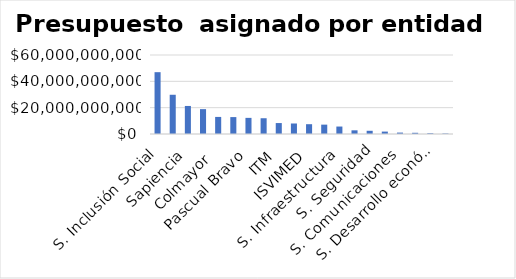
| Category | Presupuesto |
|---|---|
| S. Inclusión Social | 46953803461 |
| INDER | 29799417354 |
| Sapiencia | 21296134406 |
| S. Salud | 18881063704 |
| Colmayor  | 12969926120 |
| S. Cultura Ciudadana | 12843092527 |
| Pascual Bravo | 12250037945 |
| S. Participación Ciudadana | 11972732138 |
| ITM | 8310175528 |
| S. Medio ambiente | 7981069144 |
| ISVIMED | 7446149934 |
| S. Educación  | 7111733762 |
| S. Infraestructura | 5666421682 |
| S. Juventud | 2794085664 |
| S. Seguridad | 2446859000 |
| DAGRD | 1831250283 |
| S. Comunicaciones | 1069268456 |
| S. Gestión y Control Territorial | 920000000 |
| S. Desarrollo económico | 574557333 |
| S. de las mujeres | 367616821 |